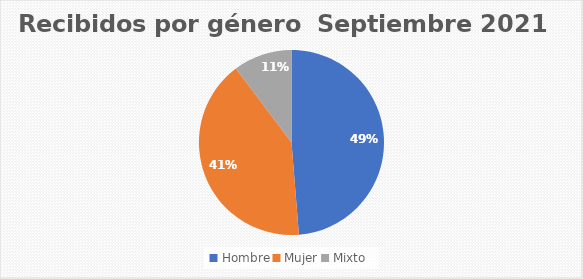
| Category | Recibidos por género  Septiembre |
|---|---|
| Hombre | 19 |
| Mujer | 16 |
| Mixto | 4 |